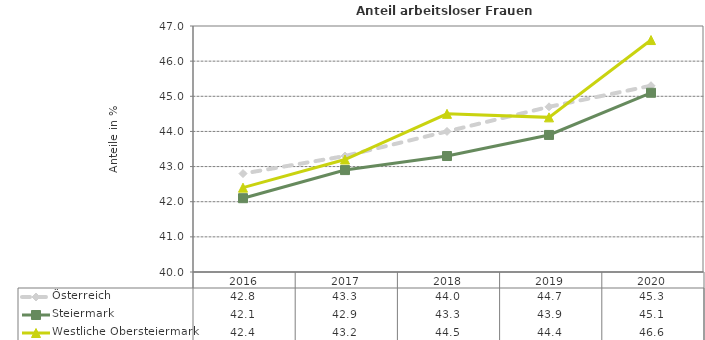
| Category | Österreich | Steiermark | Westliche Obersteiermark |
|---|---|---|---|
| 2020.0 | 45.3 | 45.1 | 46.6 |
| 2019.0 | 44.7 | 43.9 | 44.4 |
| 2018.0 | 44 | 43.3 | 44.5 |
| 2017.0 | 43.3 | 42.9 | 43.2 |
| 2016.0 | 42.8 | 42.1 | 42.4 |